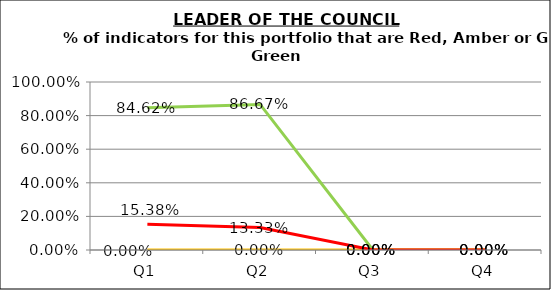
| Category | Green | Amber | Red |
|---|---|---|---|
| Q1 | 0.846 | 0 | 0.154 |
| Q2 | 0.867 | 0 | 0.133 |
| Q3 | 0 | 0 | 0 |
| Q4 | 0 | 0 | 0 |